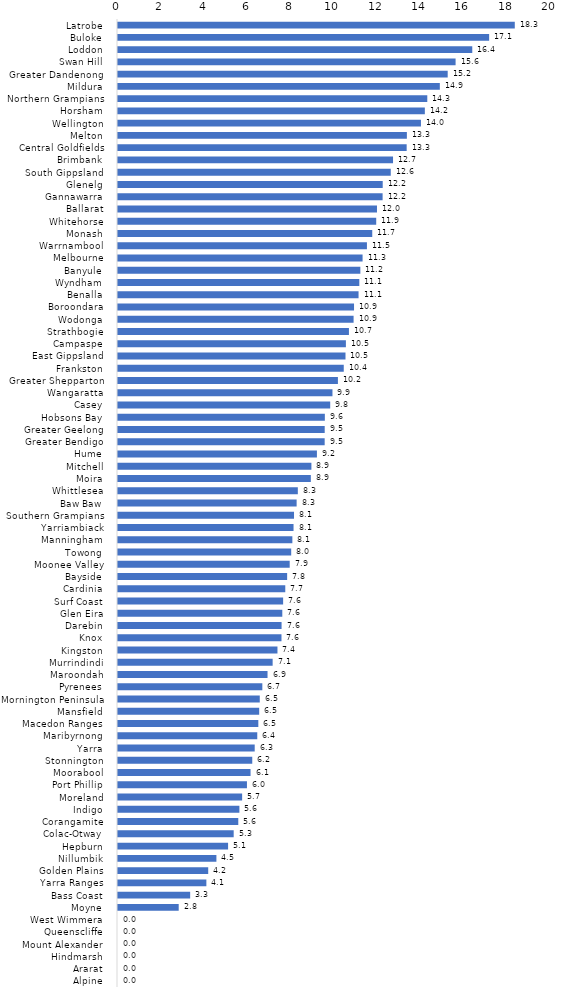
| Category | Series 0 |
|---|---|
| Latrobe  | 18.327 |
| Buloke  | 17.143 |
| Loddon  | 16.364 |
| Swan Hill  | 15.593 |
| Greater Dandenong  | 15.228 |
| Mildura  | 14.865 |
| Northern Grampians  | 14.286 |
| Horsham  | 14.173 |
| Wellington  | 13.993 |
| Melton  | 13.343 |
| Central Goldfields  | 13.333 |
| Brimbank  | 12.704 |
| South Gippsland  | 12.598 |
| Glenelg  | 12.227 |
| Gannawarra  | 12.222 |
| Ballarat  | 11.962 |
| Whitehorse  | 11.927 |
| Monash  | 11.744 |
| Warrnambool  | 11.498 |
| Melbourne  | 11.297 |
| Banyule  | 11.194 |
| Wyndham  | 11.146 |
| Benalla  | 11.111 |
| Boroondara  | 10.902 |
| Wodonga  | 10.882 |
| Strathbogie  | 10.667 |
| Campaspe  | 10.526 |
| East Gippsland  | 10.508 |
| Frankston  | 10.428 |
| Greater Shepparton  | 10.158 |
| Wangaratta  | 9.906 |
| Casey  | 9.802 |
| Hobsons Bay  | 9.554 |
| Greater Geelong  | 9.548 |
| Greater Bendigo  | 9.546 |
| Hume  | 9.188 |
| Mitchell  | 8.933 |
| Moira  | 8.907 |
| Whittlesea  | 8.306 |
| Baw Baw  | 8.251 |
| Southern Grampians  | 8.13 |
| Yarriambiack  | 8.108 |
| Manningham  | 8.054 |
| Towong  | 8 |
| Moonee Valley  | 7.931 |
| Bayside  | 7.812 |
| Cardinia  | 7.726 |
| Surf Coast  | 7.627 |
| Glen Eira  | 7.589 |
| Darebin  | 7.556 |
| Knox  | 7.551 |
| Kingston  | 7.365 |
| Murrindindi  | 7.143 |
| Maroondah  | 6.907 |
| Pyrenees  | 6.667 |
| Mornington Peninsula  | 6.548 |
| Mansfield  | 6.522 |
| Macedon Ranges  | 6.481 |
| Maribyrnong  | 6.433 |
| Yarra  | 6.314 |
| Stonnington  | 6.202 |
| Moorabool  | 6.122 |
| Port Phillip  | 5.956 |
| Moreland  | 5.734 |
| Indigo  | 5.607 |
| Corangamite  | 5.556 |
| Colac-Otway  | 5.344 |
| Hepburn  | 5.085 |
| Nillumbik  | 4.545 |
| Golden Plains  | 4.167 |
| Yarra Ranges  | 4.082 |
| Bass Coast  | 3.333 |
| Moyne  | 2.804 |
| West Wimmera  | 0 |
| Queenscliffe  | 0 |
| Mount Alexander  | 0 |
| Hindmarsh  | 0 |
| Ararat  | 0 |
| Alpine  | 0 |